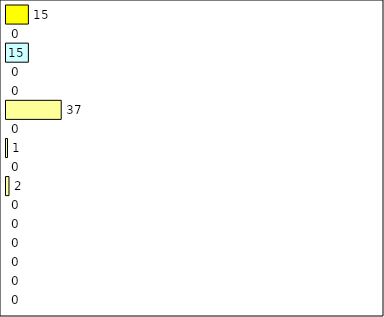
| Category | -2 | -1 | 0 | 1 | 2 | 3 | 4 | 5 | 6 | 7 | 8 | 9 | 10 | 11 | 12 | Perfect Round |
|---|---|---|---|---|---|---|---|---|---|---|---|---|---|---|---|---|
| 0 | 0 | 0 | 0 | 0 | 0 | 0 | 2 | 0 | 1 | 0 | 37 | 0 | 0 | 15 | 0 | 15 |